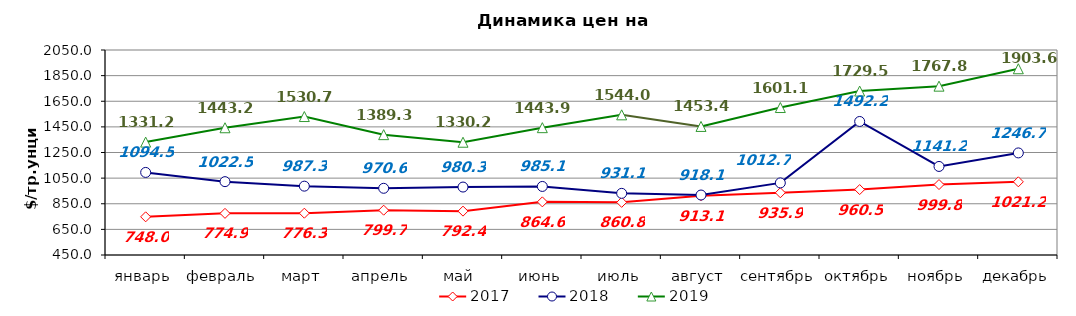
| Category | 2017 | 2018 | 2019 |
|---|---|---|---|
| январь | 748 | 1094.45 | 1331.18 |
| февраль | 774.9 | 1022.45 | 1443.15 |
| март | 776.3 | 987.33 | 1530.71 |
| апрель | 799.67 | 970.55 | 1389.3 |
| май | 792.43 | 980.3 | 1330.238 |
| июнь | 864.64 | 985.05 | 1443.85 |
| июль | 860.8 | 931.14 | 1544 |
| август | 913.1 | 918.09 | 1453.429 |
| сентябрь | 935.85 | 1012.65 | 1601.095 |
| октябрь | 960.52 | 1492.18 | 1729.545 |
| ноябрь | 999.8 | 1141.2 | 1767.762 |
| декабрь | 1021.16 | 1246.72 | 1903.61 |